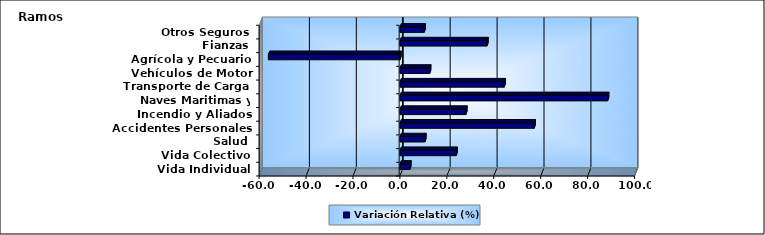
| Category | Variación Relativa (%) |
|---|---|
| Vida Individual | 4.235 |
| Vida Colectivo | 23.96 |
| Salud | 10.624 |
| Accidentes Personales | 57.208 |
| Incendio y Aliados | 28.088 |
| Naves Maritimas y Aéreas | 88.517 |
| Transporte de Carga | 44.428 |
| Vehículos de Motor | 12.667 |
| Agrícola y Pecuario | -56.097 |
| Fianzas | 37.094 |
| Otros Seguros | 10.33 |